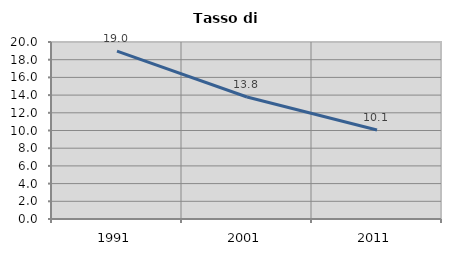
| Category | Tasso di disoccupazione   |
|---|---|
| 1991.0 | 18.971 |
| 2001.0 | 13.788 |
| 2011.0 | 10.054 |